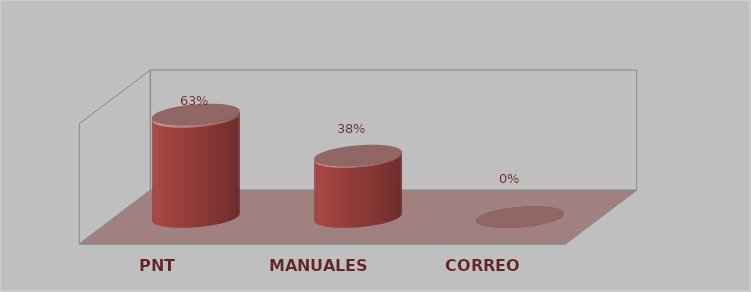
| Category | Series 0 | Series 1 |
|---|---|---|
| PNT | 25 | 0.625 |
| MANUALES | 15 | 0.375 |
| CORREO | 0 | 0 |